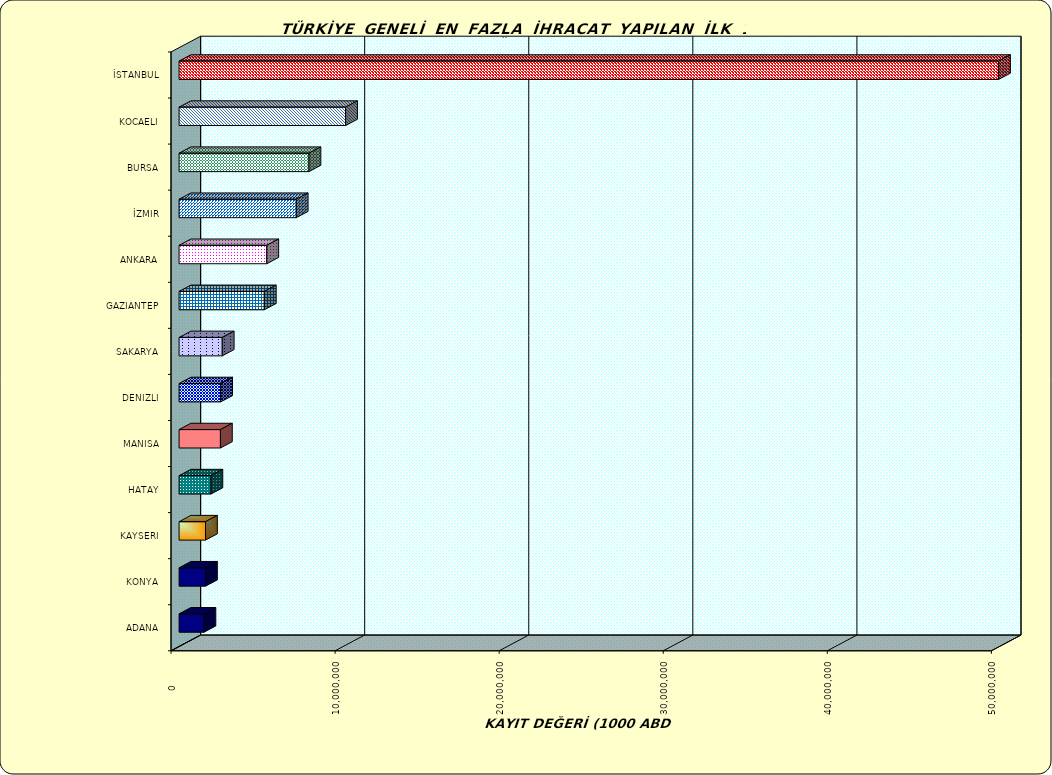
| Category | Series 0 |
|---|---|
| İSTANBUL | 49945472.94 |
| KOCAELI | 10147806.075 |
| BURSA | 7918089.631 |
| İZMIR | 7140551.052 |
| ANKARA | 5346959.063 |
| GAZIANTEP | 5194684.777 |
| SAKARYA | 2631261.198 |
| DENIZLI | 2534462.555 |
| MANISA | 2520084.173 |
| HATAY | 1940063.5 |
| KAYSERI | 1610725.513 |
| KONYA | 1609779.302 |
| ADANA | 1516060.826 |